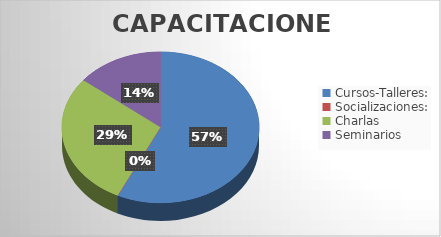
| Category | Series 0 | Series 1 |
|---|---|---|
| Cursos-Talleres: | 4 |  |
| Socializaciones: | 0 |  |
| Charlas | 2 |  |
| Seminarios | 1 |  |